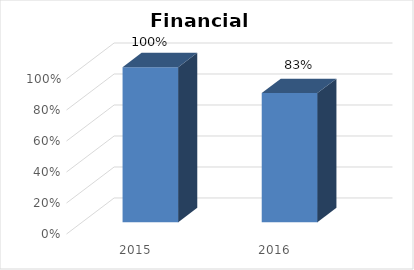
| Category | 2015 |
|---|---|
| 2015.0 | 1 |
| 2016.0 | 0.833 |